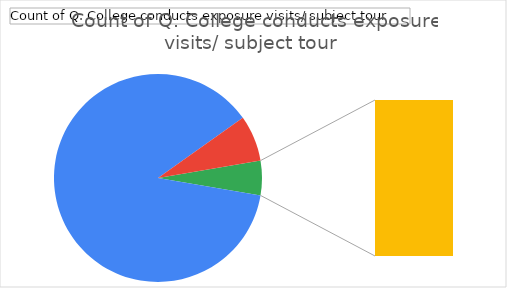
| Category | Total |
|---|---|
| Agree | 49 |
| Disagree | 4 |
| Nuutral | 3 |